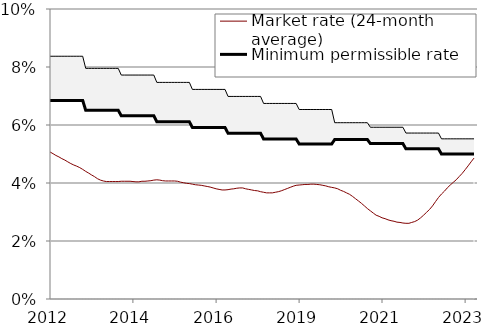
| Category | Market rate (24-month average) | Minimum permissible rate | Maximum permissible rate |
|---|---|---|---|
| 2023-12-01 | 4.86 | 4.997 | 5.523 |
| 2023-11-01 | 4.73 | 4.997 | 5.523 |
| 2023-10-01 | 4.59 | 4.997 | 5.523 |
| 2023-09-01 | 4.46 | 4.997 | 5.523 |
| 2023-08-01 | 4.33 | 4.997 | 5.523 |
| 2023-07-01 | 4.22 | 4.997 | 5.523 |
| 2023-06-01 | 4.11 | 4.997 | 5.523 |
| 2023-05-01 | 4.02 | 4.997 | 5.523 |
| 2023-04-01 | 3.93 | 4.997 | 5.523 |
| 2023-03-01 | 3.83 | 4.997 | 5.523 |
| 2023-02-01 | 3.72 | 4.997 | 5.523 |
| 2023-01-01 | 3.62 | 4.997 | 5.523 |
| 2022-12-01 | 3.5 | 5.178 | 5.722 |
| 2022-11-01 | 3.36 | 5.178 | 5.722 |
| 2022-10-01 | 3.21 | 5.178 | 5.722 |
| 2022-09-01 | 3.09 | 5.178 | 5.722 |
| 2022-08-01 | 2.99 | 5.178 | 5.722 |
| 2022-07-01 | 2.89 | 5.178 | 5.722 |
| 2022-06-01 | 2.8 | 5.178 | 5.722 |
| 2022-05-01 | 2.72 | 5.178 | 5.722 |
| 2022-04-01 | 2.67 | 5.178 | 5.722 |
| 2022-03-01 | 2.64 | 5.178 | 5.722 |
| 2022-02-01 | 2.61 | 5.178 | 5.722 |
| 2022-01-01 | 2.61 | 5.178 | 5.722 |
| 2021-12-01 | 2.62 | 5.358 | 5.922 |
| 2021-11-01 | 2.64 | 5.358 | 5.922 |
| 2021-10-01 | 2.65 | 5.358 | 5.922 |
| 2021-09-01 | 2.68 | 5.358 | 5.922 |
| 2021-08-01 | 2.7 | 5.358 | 5.922 |
| 2021-07-01 | 2.73 | 5.358 | 5.922 |
| 2021-06-01 | 2.77 | 5.358 | 5.922 |
| 2021-05-01 | 2.8 | 5.358 | 5.922 |
| 2021-04-01 | 2.85 | 5.358 | 5.922 |
| 2021-03-01 | 2.89 | 5.358 | 5.922 |
| 2021-02-01 | 2.96 | 5.358 | 5.922 |
| 2021-01-01 | 3.04 | 5.358 | 5.922 |
| 2020-12-01 | 3.12 | 5.5 | 6.08 |
| 2020-11-01 | 3.21 | 5.5 | 6.08 |
| 2020-10-01 | 3.3 | 5.5 | 6.08 |
| 2020-09-01 | 3.38 | 5.5 | 6.08 |
| 2020-08-01 | 3.46 | 5.5 | 6.08 |
| 2020-07-01 | 3.54 | 5.5 | 6.08 |
| 2020-06-01 | 3.61 | 5.5 | 6.08 |
| 2020-05-01 | 3.66 | 5.5 | 6.08 |
| 2020-04-01 | 3.71 | 5.5 | 6.08 |
| 2020-03-01 | 3.75 | 5.5 | 6.08 |
| 2020-02-01 | 3.8 | 5.5 | 6.08 |
| 2020-01-01 | 3.83 | 5.5 | 6.08 |
| 2019-12-01 | 3.85 | 5.346 | 6.534 |
| 2019-11-01 | 3.87 | 5.346 | 6.534 |
| 2019-10-01 | 3.9 | 5.346 | 6.534 |
| 2019-09-01 | 3.92 | 5.346 | 6.534 |
| 2019-08-01 | 3.94 | 5.346 | 6.534 |
| 2019-07-01 | 3.95 | 5.346 | 6.534 |
| 2019-06-01 | 3.96 | 5.346 | 6.534 |
| 2019-05-01 | 3.96 | 5.346 | 6.534 |
| 2019-04-01 | 3.95 | 5.346 | 6.534 |
| 2019-03-01 | 3.95 | 5.346 | 6.534 |
| 2019-02-01 | 3.94 | 5.346 | 6.534 |
| 2019-01-01 | 3.93 | 5.346 | 6.534 |
| 2018-12-01 | 3.92 | 5.517 | 6.743 |
| 2018-11-01 | 3.89 | 5.517 | 6.743 |
| 2018-10-01 | 3.85 | 5.517 | 6.743 |
| 2018-09-01 | 3.81 | 5.517 | 6.743 |
| 2018-08-01 | 3.77 | 5.517 | 6.743 |
| 2018-07-01 | 3.73 | 5.517 | 6.743 |
| 2018-06-01 | 3.7 | 5.517 | 6.743 |
| 2018-05-01 | 3.68 | 5.517 | 6.743 |
| 2018-04-01 | 3.66 | 5.517 | 6.743 |
| 2018-03-01 | 3.66 | 5.517 | 6.743 |
| 2018-02-01 | 3.66 | 5.517 | 6.743 |
| 2018-01-01 | 3.68 | 5.517 | 6.743 |
| 2017-12-01 | 3.7 | 5.715 | 6.985 |
| 2017-11-01 | 3.73 | 5.715 | 6.985 |
| 2017-10-01 | 3.74 | 5.715 | 6.985 |
| 2017-09-01 | 3.76 | 5.715 | 6.985 |
| 2017-08-01 | 3.78 | 5.715 | 6.985 |
| 2017-07-01 | 3.8 | 5.715 | 6.985 |
| 2017-06-01 | 3.83 | 5.715 | 6.985 |
| 2017-05-01 | 3.83 | 5.715 | 6.985 |
| 2017-04-01 | 3.82 | 5.715 | 6.985 |
| 2017-03-01 | 3.8 | 5.715 | 6.985 |
| 2017-02-01 | 3.79 | 5.715 | 6.985 |
| 2017-01-01 | 3.77 | 5.715 | 6.985 |
| 2016-12-01 | 3.76 | 5.913 | 7.227 |
| 2016-11-01 | 3.76 | 5.913 | 7.227 |
| 2016-10-01 | 3.78 | 5.913 | 7.227 |
| 2016-09-01 | 3.8 | 5.913 | 7.227 |
| 2016-08-01 | 3.83 | 5.913 | 7.227 |
| 2016-07-01 | 3.86 | 5.913 | 7.227 |
| 2016-06-01 | 3.88 | 5.913 | 7.227 |
| 2016-05-01 | 3.9 | 5.913 | 7.227 |
| 2016-04-01 | 3.92 | 5.913 | 7.227 |
| 2016-03-01 | 3.93 | 5.913 | 7.227 |
| 2016-02-01 | 3.94 | 5.913 | 7.227 |
| 2016-01-01 | 3.96 | 5.913 | 7.227 |
| 2015-12-01 | 3.98 | 6.111 | 7.469 |
| 2015-11-01 | 3.99 | 6.111 | 7.469 |
| 2015-10-01 | 4.01 | 6.111 | 7.469 |
| 2015-09-01 | 4.03 | 6.111 | 7.469 |
| 2015-08-01 | 4.06 | 6.111 | 7.469 |
| 2015-07-01 | 4.07 | 6.111 | 7.469 |
| 2015-06-01 | 4.07 | 6.111 | 7.469 |
| 2015-05-01 | 4.07 | 6.111 | 7.469 |
| 2015-04-01 | 4.07 | 6.111 | 7.469 |
| 2015-03-01 | 4.08 | 6.111 | 7.469 |
| 2015-02-01 | 4.1 | 6.111 | 7.469 |
| 2015-01-01 | 4.11 | 6.111 | 7.469 |
| 2014-12-01 | 4.1 | 6.318 | 7.722 |
| 2014-11-01 | 4.08 | 6.318 | 7.722 |
| 2014-10-01 | 4.07 | 6.318 | 7.722 |
| 2014-09-01 | 4.06 | 6.318 | 7.722 |
| 2014-08-01 | 4.06 | 6.318 | 7.722 |
| 2014-07-01 | 4.04 | 6.318 | 7.722 |
| 2014-06-01 | 4.04 | 6.318 | 7.722 |
| 2014-05-01 | 4.05 | 6.318 | 7.722 |
| 2014-04-01 | 4.06 | 6.318 | 7.722 |
| 2014-03-01 | 4.06 | 6.318 | 7.722 |
| 2014-02-01 | 4.06 | 6.318 | 7.722 |
| 2014-01-01 | 4.06 | 6.318 | 7.722 |
| 2013-12-01 | 4.05 | 6.507 | 7.953 |
| 2013-11-01 | 4.05 | 6.507 | 7.953 |
| 2013-10-01 | 4.05 | 6.507 | 7.953 |
| 2013-09-01 | 4.05 | 6.507 | 7.953 |
| 2013-08-01 | 4.05 | 6.507 | 7.953 |
| 2013-07-01 | 4.07 | 6.507 | 7.953 |
| 2013-06-01 | 4.1 | 6.507 | 7.953 |
| 2013-05-01 | 4.15 | 6.507 | 7.953 |
| 2013-04-01 | 4.22 | 6.507 | 7.953 |
| 2013-03-01 | 4.28 | 6.507 | 7.953 |
| 2013-02-01 | 4.34 | 6.507 | 7.953 |
| 2013-01-01 | 4.4 | 6.507 | 7.953 |
| 2012-12-01 | 4.47 | 6.849 | 8.371 |
| 2012-11-01 | 4.53 | 6.849 | 8.371 |
| 2012-10-01 | 4.58 | 6.849 | 8.371 |
| 2012-09-01 | 4.62 | 6.849 | 8.371 |
| 2012-08-01 | 4.67 | 6.849 | 8.371 |
| 2012-07-01 | 4.73 | 6.849 | 8.371 |
| 2012-06-01 | 4.79 | 6.849 | 8.371 |
| 2012-05-01 | 4.84 | 6.849 | 8.371 |
| 2012-04-01 | 4.9 | 6.849 | 8.371 |
| 2012-03-01 | 4.95 | 6.849 | 8.371 |
| 2012-02-01 | 5.01 | 6.849 | 8.371 |
| 2012-01-01 | 5.07 | 6.849 | 8.371 |